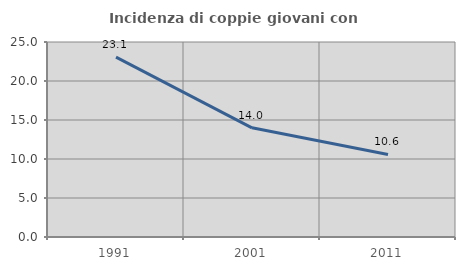
| Category | Incidenza di coppie giovani con figli |
|---|---|
| 1991.0 | 23.053 |
| 2001.0 | 14 |
| 2011.0 | 10.582 |